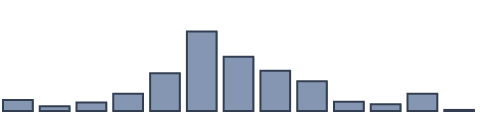
| Category | Series 0 |
|---|---|
| 0 | 3.47 |
| 1 | 1.473 |
| 2 | 2.716 |
| 3 | 5.415 |
| 4 | 11.874 |
| 5 | 25.092 |
| 6 | 17.078 |
| 7 | 12.722 |
| 8 | 9.355 |
| 9 | 2.884 |
| 10 | 2.137 |
| 11 | 5.446 |
| 12 | 0.338 |